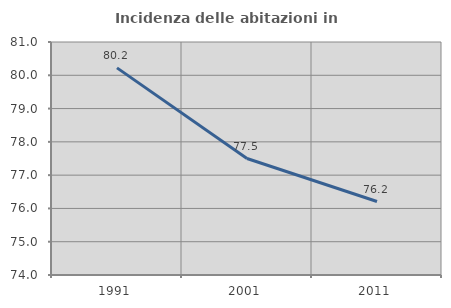
| Category | Incidenza delle abitazioni in proprietà  |
|---|---|
| 1991.0 | 80.223 |
| 2001.0 | 77.5 |
| 2011.0 | 76.207 |